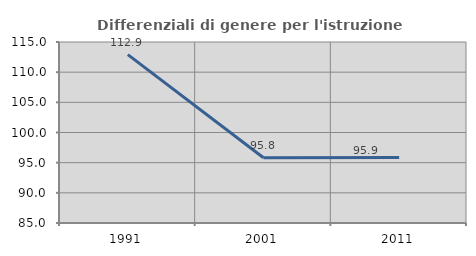
| Category | Differenziali di genere per l'istruzione superiore |
|---|---|
| 1991.0 | 112.917 |
| 2001.0 | 95.82 |
| 2011.0 | 95.876 |